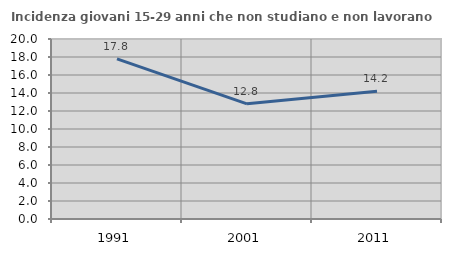
| Category | Incidenza giovani 15-29 anni che non studiano e non lavorano  |
|---|---|
| 1991.0 | 17.798 |
| 2001.0 | 12.8 |
| 2011.0 | 14.191 |